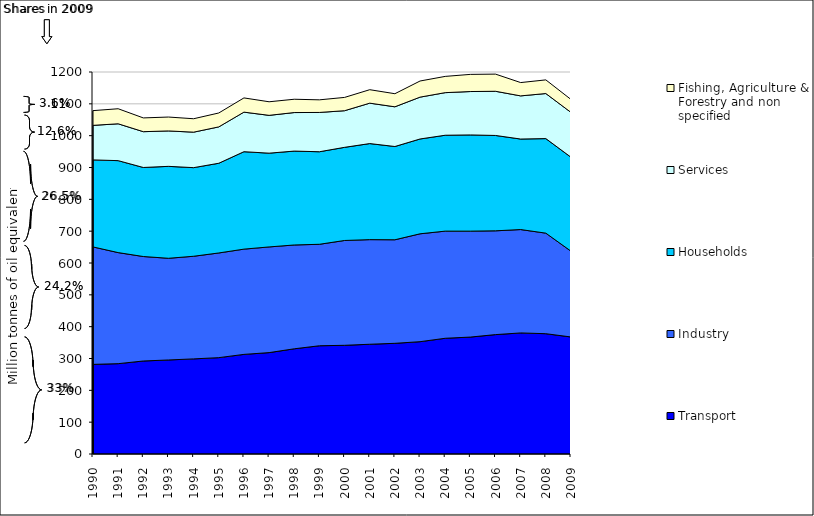
| Category | Transport | Industry | Households | Services | Fishing, Agriculture & Forestry and non specified |
|---|---|---|---|---|---|
| 1990.0 | 281.549 | 368.924 | 273.384 | 108.488 | 46.283 |
| 1991.0 | 283.757 | 348.91 | 288.907 | 115.75 | 47.269 |
| 1992.0 | 292.148 | 328.221 | 279.717 | 112.458 | 43.241 |
| 1993.0 | 295.434 | 319.358 | 288.812 | 111.272 | 43.631 |
| 1994.0 | 298.822 | 322.341 | 278.384 | 111.471 | 42.134 |
| 1995.0 | 302.673 | 328.869 | 281.809 | 114.225 | 43.685 |
| 1996.0 | 312.925 | 330.641 | 306.082 | 124.268 | 44.664 |
| 1997.0 | 318.484 | 332.001 | 294.564 | 118.782 | 42.656 |
| 1998.0 | 330.524 | 326.115 | 294.942 | 120.998 | 41.827 |
| 1999.0 | 340.005 | 318.754 | 290.739 | 123.467 | 39.61 |
| 2000.0 | 341.444 | 329.328 | 292.551 | 115.073 | 41.749 |
| 2001.0 | 344.803 | 328.611 | 301.745 | 126.966 | 42.271 |
| 2002.0 | 347.682 | 325.266 | 292.999 | 124.723 | 41.131 |
| 2003.0 | 352.854 | 338.859 | 297.866 | 131.448 | 50.669 |
| 2004.0 | 363.557 | 336.527 | 301.236 | 133.811 | 51.058 |
| 2005.0 | 367.317 | 332.804 | 302.209 | 136.294 | 53.912 |
| 2006.0 | 375.053 | 326.046 | 299.558 | 138.79 | 53.909 |
| 2007.0 | 380.333 | 324.736 | 284.345 | 135.537 | 41.847 |
| 2008.0 | 377.905 | 315.869 | 297.019 | 141.522 | 42.92 |
| 2009.0 | 367.636 | 269.455 | 295.206 | 140.76 | 40.614 |